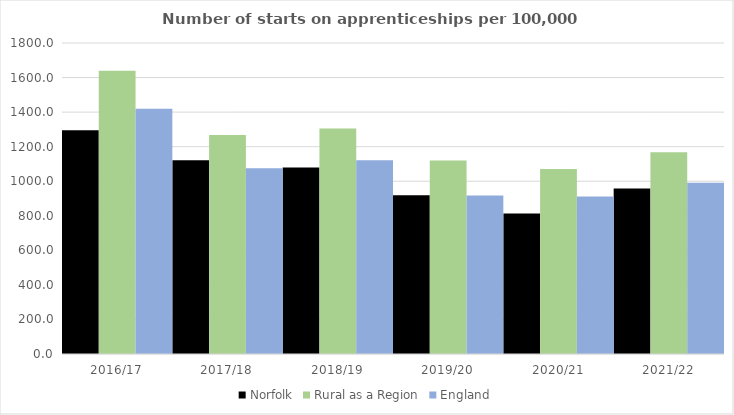
| Category | Norfolk | Rural as a Region | England |
|---|---|---|---|
| 2016/17 | 1294.402 | 1638.789 | 1420 |
| 2017/18 | 1121.786 | 1267.474 | 1075 |
| 2018/19 | 1079.423 | 1304.57 | 1122 |
| 2019/20 | 918.794 | 1119.662 | 918 |
| 2020/21 | 813.48 | 1070.748 | 912 |
| 2021/22 | 957.658 | 1167.68 | 991 |